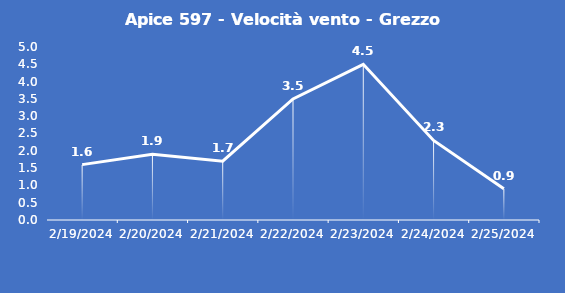
| Category | Apice 597 - Velocità vento - Grezzo (m/s) |
|---|---|
| 2/19/24 | 1.6 |
| 2/20/24 | 1.9 |
| 2/21/24 | 1.7 |
| 2/22/24 | 3.5 |
| 2/23/24 | 4.5 |
| 2/24/24 | 2.3 |
| 2/25/24 | 0.9 |